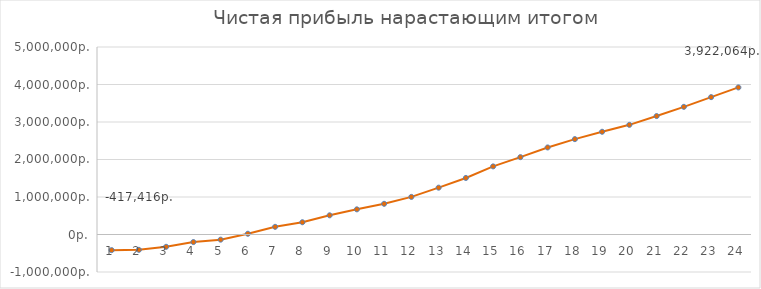
| Category | Series 0 |
|---|---|
| 0 | -417415.633 |
| 1 | -408872.417 |
| 2 | -328370.35 |
| 3 | -201888.858 |
| 4 | -137366.217 |
| 5 | 20094.7 |
| 6 | 204514.467 |
| 7 | 326975.383 |
| 8 | 511395.15 |
| 9 | 671031.377 |
| 10 | 818275.833 |
| 11 | 1002695.6 |
| 12 | 1249074.217 |
| 13 | 1507844.603 |
| 14 | 1816182.07 |
| 15 | 2062560.687 |
| 16 | 2321331.073 |
| 17 | 2542926.15 |
| 18 | 2739737.687 |
| 19 | 2924157.453 |
| 20 | 3158144.3 |
| 21 | 3404522.917 |
| 22 | 3663293.303 |
| 23 | 3922063.69 |